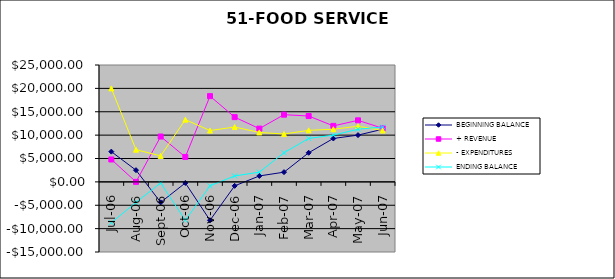
| Category | BEGINNING BALANCE | + REVENUE | - EXPENDITURES | ENDING BALANCE |
|---|---|---|---|---|
| 2006-07-01 | 6466.49 | 4791.82 | 19991.91 | -8733.6 |
| 2006-08-01 | 2501.24 | 0 | 6882.09 | -4380.85 |
| 2006-09-01 | -4380.85 | 9696.9 | 5551.96 | -235.91 |
| 2006-10-01 | -235.91 | 5328.35 | 13304.82 | -8212.38 |
| 2006-11-01 | -8212.38 | 18340.18 | 10977.38 | -849.58 |
| 2006-12-01 | -849.58 | 13848.22 | 11730.56 | 1268.08 |
| 2007-01-01 | 1268.08 | 11391.25 | 10580.65 | 2078.68 |
| 2007-02-01 | 2078.68 | 14377.29 | 10230.49 | 6225.48 |
| 2007-03-01 | 6225.48 | 14085.6 | 11023.07 | 9288.01 |
| 2007-04-01 | 9288.01 | 11973.47 | 11258.38 | 10003.1 |
| 2007-05-01 | 10003.1 | 13164.65 | 11906.93 | 11260.82 |
| 2007-06-01 | 11260.82 | 11460.65 | 10986.04 | 11735.43 |